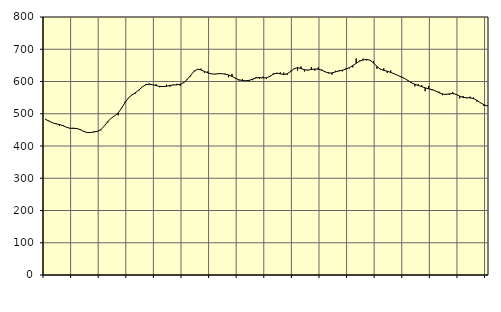
| Category | Piggar | Series 1 |
|---|---|---|
| nan | 484.3 | 482.21 |
| 87.0 | 478.1 | 477 |
| 87.0 | 471.3 | 471.91 |
| 87.0 | 470.2 | 468.63 |
| nan | 462.1 | 466.55 |
| 88.0 | 465.1 | 463.04 |
| 88.0 | 458 | 458.35 |
| 88.0 | 453.9 | 455.1 |
| nan | 456.8 | 454.6 |
| 89.0 | 455.7 | 454.3 |
| 89.0 | 452.7 | 450.87 |
| 89.0 | 444.4 | 445.42 |
| nan | 440.9 | 441.78 |
| 90.0 | 442.4 | 441.8 |
| 90.0 | 445.5 | 443.42 |
| 90.0 | 444.5 | 445.49 |
| nan | 448.5 | 451.05 |
| 91.0 | 462.4 | 462.18 |
| 91.0 | 473 | 475.91 |
| 91.0 | 486.8 | 486.66 |
| nan | 493.2 | 493.52 |
| 92.0 | 495.2 | 502.69 |
| 92.0 | 518.6 | 517.6 |
| 92.0 | 538 | 535.07 |
| nan | 548.4 | 549.22 |
| 93.0 | 559 | 558.13 |
| 93.0 | 562.6 | 565.29 |
| 93.0 | 571.8 | 573.62 |
| nan | 584.2 | 583.26 |
| 94.0 | 592 | 590.13 |
| 94.0 | 594.1 | 591.77 |
| 94.0 | 589.4 | 589.97 |
| nan | 591.7 | 587.15 |
| 95.0 | 582.3 | 585 |
| 95.0 | 584.1 | 584.28 |
| 95.0 | 590 | 585.3 |
| nan | 584.1 | 587.66 |
| 96.0 | 590.7 | 589.14 |
| 96.0 | 592.8 | 589.65 |
| 96.0 | 586.2 | 591.55 |
| nan | 597.4 | 596.36 |
| 97.0 | 605 | 606.16 |
| 97.0 | 615.8 | 619.02 |
| 97.0 | 633.2 | 631.64 |
| nan | 638.4 | 638.04 |
| 98.0 | 639.8 | 636.21 |
| 98.0 | 627.3 | 631.21 |
| 98.0 | 631.7 | 626.67 |
| nan | 623.3 | 623.71 |
| 99.0 | 622.2 | 622.95 |
| 99.0 | 625.4 | 624.21 |
| 99.0 | 623.8 | 624.46 |
| nan | 624.3 | 622.75 |
| 0.0 | 613.1 | 620.24 |
| 0.0 | 623.4 | 615.93 |
| 0.0 | 608.1 | 610.12 |
| nan | 603.1 | 605.36 |
| 1.0 | 607.3 | 603.04 |
| 1.0 | 601.8 | 602.38 |
| 1.0 | 600.8 | 603.6 |
| nan | 604.2 | 607.31 |
| 2.0 | 614.1 | 611.13 |
| 2.0 | 608.2 | 612.34 |
| 2.0 | 615.1 | 611.04 |
| nan | 608.4 | 611.57 |
| 3.0 | 614.5 | 616.06 |
| 3.0 | 626.3 | 622.74 |
| 3.0 | 623.5 | 626.14 |
| nan | 628.2 | 623.94 |
| 4.0 | 627.6 | 621.59 |
| 4.0 | 620.5 | 623.83 |
| 4.0 | 633.2 | 631.03 |
| nan | 640.3 | 639.47 |
| 5.0 | 634.1 | 643.1 |
| 5.0 | 646.3 | 640.41 |
| 5.0 | 631 | 636.49 |
| nan | 634.3 | 635.44 |
| 6.0 | 644.8 | 637.04 |
| 6.0 | 634.1 | 638.79 |
| 6.0 | 643.6 | 638.07 |
| nan | 637.1 | 635.23 |
| 7.0 | 629.3 | 630.08 |
| 7.0 | 628.1 | 625.97 |
| 7.0 | 621.3 | 626.61 |
| nan | 633.1 | 629.83 |
| 8.0 | 634.2 | 632.7 |
| 8.0 | 631.5 | 634.87 |
| 8.0 | 640.5 | 638.15 |
| nan | 640.7 | 642.96 |
| 9.0 | 643.8 | 649.15 |
| 9.0 | 671.4 | 656.53 |
| 9.0 | 664.8 | 663.24 |
| nan | 670.8 | 666.87 |
| 10.0 | 665.4 | 668.26 |
| 10.0 | 666.6 | 666.19 |
| 10.0 | 663.3 | 657.97 |
| nan | 639.7 | 646.7 |
| 11.0 | 637.2 | 638.36 |
| 11.0 | 640.8 | 634.42 |
| 11.0 | 626.9 | 631.9 |
| nan | 634.2 | 628.26 |
| 12.0 | 623.2 | 623.98 |
| 12.0 | 618.5 | 619.33 |
| 12.0 | 615.9 | 614.27 |
| nan | 610.9 | 609.63 |
| 13.0 | 601.7 | 603.18 |
| 13.0 | 598.6 | 596.08 |
| 13.0 | 584.9 | 591.31 |
| nan | 591.5 | 587.63 |
| 14.0 | 588.8 | 584.09 |
| 14.0 | 570 | 580.3 |
| 14.0 | 586 | 577.19 |
| nan | 572.9 | 574.84 |
| 15.0 | 570.4 | 570.59 |
| 15.0 | 568.6 | 565.42 |
| 15.0 | 557.5 | 561.4 |
| nan | 561.4 | 559.8 |
| 16.0 | 559.1 | 561.73 |
| 16.0 | 566.8 | 562.68 |
| 16.0 | 558.7 | 559.87 |
| nan | 547.7 | 554.69 |
| 17.0 | 554.8 | 550.54 |
| 17.0 | 548.3 | 549.6 |
| 17.0 | 553 | 549.22 |
| nan | 550.3 | 547.04 |
| 18.0 | 537.9 | 541.7 |
| 18.0 | 535.1 | 534.13 |
| 18.0 | 524.4 | 528.05 |
| nan | 526.7 | 524.21 |